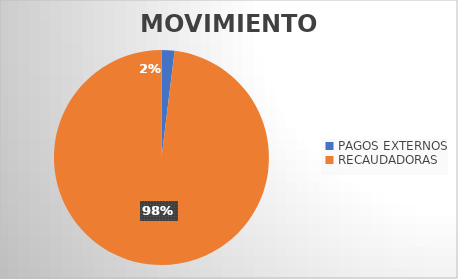
| Category | MOVIMIENTOS |
|---|---|
| PAGOS EXTERNOS | 564 |
| RECAUDADORAS | 28334 |